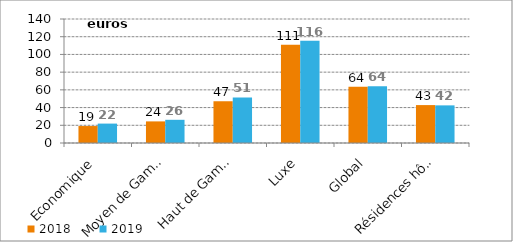
| Category | 2018 | 2019 |
|---|---|---|
| Economique | 19.147 | 21.913 |
| Moyen de Gamme | 24.391 | 26.19 |
| Haut de Gamme | 47.14 | 51.445 |
| Luxe | 110.987 | 115.514 |
| Global | 63.593 | 64.199 |
| Résidences hôtelières | 42.807 | 42.487 |